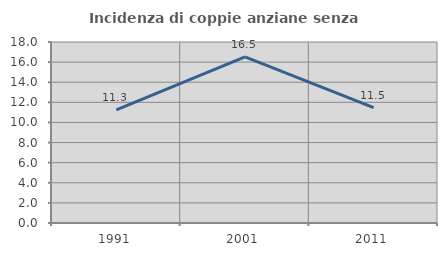
| Category | Incidenza di coppie anziane senza figli  |
|---|---|
| 1991.0 | 11.255 |
| 2001.0 | 16.525 |
| 2011.0 | 11.481 |